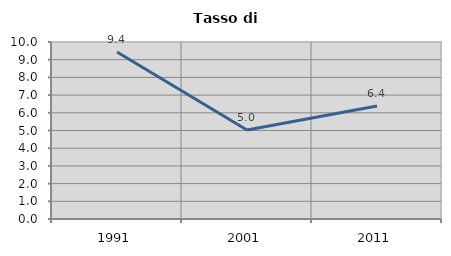
| Category | Tasso di disoccupazione   |
|---|---|
| 1991.0 | 9.436 |
| 2001.0 | 5.025 |
| 2011.0 | 6.387 |